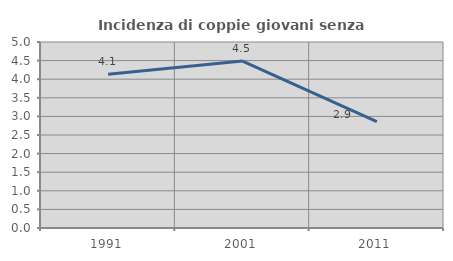
| Category | Incidenza di coppie giovani senza figli |
|---|---|
| 1991.0 | 4.132 |
| 2001.0 | 4.487 |
| 2011.0 | 2.859 |